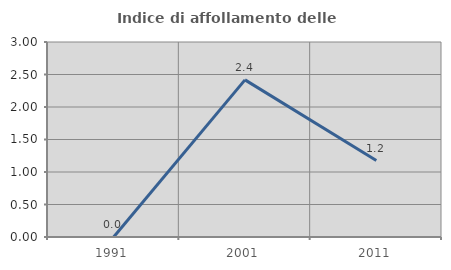
| Category | Indice di affollamento delle abitazioni  |
|---|---|
| 1991.0 | 0 |
| 2001.0 | 2.417 |
| 2011.0 | 1.176 |